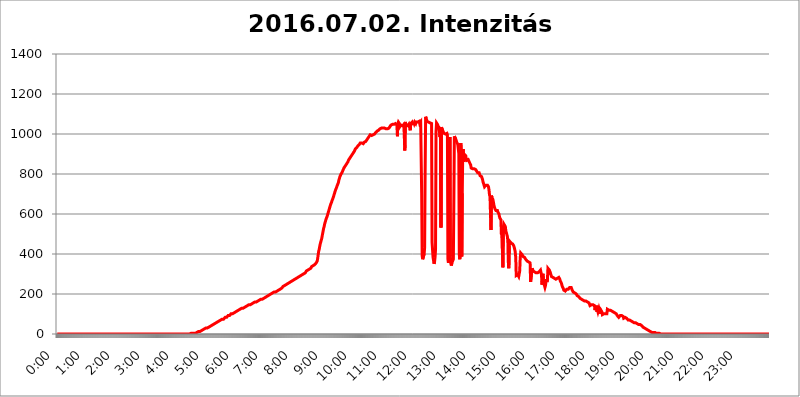
| Category | 2016.07.02. Intenzitás [W/m^2] |
|---|---|
| 0.0 | 0 |
| 0.0006944444444444445 | 0 |
| 0.001388888888888889 | 0 |
| 0.0020833333333333333 | 0 |
| 0.002777777777777778 | 0 |
| 0.003472222222222222 | 0 |
| 0.004166666666666667 | 0 |
| 0.004861111111111111 | 0 |
| 0.005555555555555556 | 0 |
| 0.0062499999999999995 | 0 |
| 0.006944444444444444 | 0 |
| 0.007638888888888889 | 0 |
| 0.008333333333333333 | 0 |
| 0.009027777777777779 | 0 |
| 0.009722222222222222 | 0 |
| 0.010416666666666666 | 0 |
| 0.011111111111111112 | 0 |
| 0.011805555555555555 | 0 |
| 0.012499999999999999 | 0 |
| 0.013194444444444444 | 0 |
| 0.013888888888888888 | 0 |
| 0.014583333333333332 | 0 |
| 0.015277777777777777 | 0 |
| 0.015972222222222224 | 0 |
| 0.016666666666666666 | 0 |
| 0.017361111111111112 | 0 |
| 0.018055555555555557 | 0 |
| 0.01875 | 0 |
| 0.019444444444444445 | 0 |
| 0.02013888888888889 | 0 |
| 0.020833333333333332 | 0 |
| 0.02152777777777778 | 0 |
| 0.022222222222222223 | 0 |
| 0.02291666666666667 | 0 |
| 0.02361111111111111 | 0 |
| 0.024305555555555556 | 0 |
| 0.024999999999999998 | 0 |
| 0.025694444444444447 | 0 |
| 0.02638888888888889 | 0 |
| 0.027083333333333334 | 0 |
| 0.027777777777777776 | 0 |
| 0.02847222222222222 | 0 |
| 0.029166666666666664 | 0 |
| 0.029861111111111113 | 0 |
| 0.030555555555555555 | 0 |
| 0.03125 | 0 |
| 0.03194444444444445 | 0 |
| 0.03263888888888889 | 0 |
| 0.03333333333333333 | 0 |
| 0.034027777777777775 | 0 |
| 0.034722222222222224 | 0 |
| 0.035416666666666666 | 0 |
| 0.036111111111111115 | 0 |
| 0.03680555555555556 | 0 |
| 0.0375 | 0 |
| 0.03819444444444444 | 0 |
| 0.03888888888888889 | 0 |
| 0.03958333333333333 | 0 |
| 0.04027777777777778 | 0 |
| 0.04097222222222222 | 0 |
| 0.041666666666666664 | 0 |
| 0.042361111111111106 | 0 |
| 0.04305555555555556 | 0 |
| 0.043750000000000004 | 0 |
| 0.044444444444444446 | 0 |
| 0.04513888888888889 | 0 |
| 0.04583333333333334 | 0 |
| 0.04652777777777778 | 0 |
| 0.04722222222222222 | 0 |
| 0.04791666666666666 | 0 |
| 0.04861111111111111 | 0 |
| 0.049305555555555554 | 0 |
| 0.049999999999999996 | 0 |
| 0.05069444444444445 | 0 |
| 0.051388888888888894 | 0 |
| 0.052083333333333336 | 0 |
| 0.05277777777777778 | 0 |
| 0.05347222222222222 | 0 |
| 0.05416666666666667 | 0 |
| 0.05486111111111111 | 0 |
| 0.05555555555555555 | 0 |
| 0.05625 | 0 |
| 0.05694444444444444 | 0 |
| 0.057638888888888885 | 0 |
| 0.05833333333333333 | 0 |
| 0.05902777777777778 | 0 |
| 0.059722222222222225 | 0 |
| 0.06041666666666667 | 0 |
| 0.061111111111111116 | 0 |
| 0.06180555555555556 | 0 |
| 0.0625 | 0 |
| 0.06319444444444444 | 0 |
| 0.06388888888888888 | 0 |
| 0.06458333333333334 | 0 |
| 0.06527777777777778 | 0 |
| 0.06597222222222222 | 0 |
| 0.06666666666666667 | 0 |
| 0.06736111111111111 | 0 |
| 0.06805555555555555 | 0 |
| 0.06874999999999999 | 0 |
| 0.06944444444444443 | 0 |
| 0.07013888888888889 | 0 |
| 0.07083333333333333 | 0 |
| 0.07152777777777779 | 0 |
| 0.07222222222222223 | 0 |
| 0.07291666666666667 | 0 |
| 0.07361111111111111 | 0 |
| 0.07430555555555556 | 0 |
| 0.075 | 0 |
| 0.07569444444444444 | 0 |
| 0.0763888888888889 | 0 |
| 0.07708333333333334 | 0 |
| 0.07777777777777778 | 0 |
| 0.07847222222222222 | 0 |
| 0.07916666666666666 | 0 |
| 0.0798611111111111 | 0 |
| 0.08055555555555556 | 0 |
| 0.08125 | 0 |
| 0.08194444444444444 | 0 |
| 0.08263888888888889 | 0 |
| 0.08333333333333333 | 0 |
| 0.08402777777777777 | 0 |
| 0.08472222222222221 | 0 |
| 0.08541666666666665 | 0 |
| 0.08611111111111112 | 0 |
| 0.08680555555555557 | 0 |
| 0.08750000000000001 | 0 |
| 0.08819444444444445 | 0 |
| 0.08888888888888889 | 0 |
| 0.08958333333333333 | 0 |
| 0.09027777777777778 | 0 |
| 0.09097222222222222 | 0 |
| 0.09166666666666667 | 0 |
| 0.09236111111111112 | 0 |
| 0.09305555555555556 | 0 |
| 0.09375 | 0 |
| 0.09444444444444444 | 0 |
| 0.09513888888888888 | 0 |
| 0.09583333333333333 | 0 |
| 0.09652777777777777 | 0 |
| 0.09722222222222222 | 0 |
| 0.09791666666666667 | 0 |
| 0.09861111111111111 | 0 |
| 0.09930555555555555 | 0 |
| 0.09999999999999999 | 0 |
| 0.10069444444444443 | 0 |
| 0.1013888888888889 | 0 |
| 0.10208333333333335 | 0 |
| 0.10277777777777779 | 0 |
| 0.10347222222222223 | 0 |
| 0.10416666666666667 | 0 |
| 0.10486111111111111 | 0 |
| 0.10555555555555556 | 0 |
| 0.10625 | 0 |
| 0.10694444444444444 | 0 |
| 0.1076388888888889 | 0 |
| 0.10833333333333334 | 0 |
| 0.10902777777777778 | 0 |
| 0.10972222222222222 | 0 |
| 0.1111111111111111 | 0 |
| 0.11180555555555556 | 0 |
| 0.11180555555555556 | 0 |
| 0.1125 | 0 |
| 0.11319444444444444 | 0 |
| 0.11388888888888889 | 0 |
| 0.11458333333333333 | 0 |
| 0.11527777777777777 | 0 |
| 0.11597222222222221 | 0 |
| 0.11666666666666665 | 0 |
| 0.1173611111111111 | 0 |
| 0.11805555555555557 | 0 |
| 0.11944444444444445 | 0 |
| 0.12013888888888889 | 0 |
| 0.12083333333333333 | 0 |
| 0.12152777777777778 | 0 |
| 0.12222222222222223 | 0 |
| 0.12291666666666667 | 0 |
| 0.12291666666666667 | 0 |
| 0.12361111111111112 | 0 |
| 0.12430555555555556 | 0 |
| 0.125 | 0 |
| 0.12569444444444444 | 0 |
| 0.12638888888888888 | 0 |
| 0.12708333333333333 | 0 |
| 0.16875 | 0 |
| 0.12847222222222224 | 0 |
| 0.12916666666666668 | 0 |
| 0.12986111111111112 | 0 |
| 0.13055555555555556 | 0 |
| 0.13125 | 0 |
| 0.13194444444444445 | 0 |
| 0.1326388888888889 | 0 |
| 0.13333333333333333 | 0 |
| 0.13402777777777777 | 0 |
| 0.13402777777777777 | 0 |
| 0.13472222222222222 | 0 |
| 0.13541666666666666 | 0 |
| 0.1361111111111111 | 0 |
| 0.13749999999999998 | 0 |
| 0.13819444444444443 | 0 |
| 0.1388888888888889 | 0 |
| 0.13958333333333334 | 0 |
| 0.14027777777777778 | 0 |
| 0.14097222222222222 | 0 |
| 0.14166666666666666 | 0 |
| 0.1423611111111111 | 0 |
| 0.14305555555555557 | 0 |
| 0.14375000000000002 | 0 |
| 0.14444444444444446 | 0 |
| 0.1451388888888889 | 0 |
| 0.1451388888888889 | 0 |
| 0.14652777777777778 | 0 |
| 0.14722222222222223 | 0 |
| 0.14791666666666667 | 0 |
| 0.1486111111111111 | 0 |
| 0.14930555555555555 | 0 |
| 0.15 | 0 |
| 0.15069444444444444 | 0 |
| 0.15138888888888888 | 0 |
| 0.15208333333333332 | 0 |
| 0.15277777777777776 | 0 |
| 0.15347222222222223 | 0 |
| 0.15416666666666667 | 0 |
| 0.15486111111111112 | 0 |
| 0.15555555555555556 | 0 |
| 0.15625 | 0 |
| 0.15694444444444444 | 0 |
| 0.15763888888888888 | 0 |
| 0.15833333333333333 | 0 |
| 0.15902777777777777 | 0 |
| 0.15972222222222224 | 0 |
| 0.16041666666666668 | 0 |
| 0.16111111111111112 | 0 |
| 0.16180555555555556 | 0 |
| 0.1625 | 0 |
| 0.16319444444444445 | 0 |
| 0.1638888888888889 | 0 |
| 0.16458333333333333 | 0 |
| 0.16527777777777777 | 0 |
| 0.16597222222222222 | 0 |
| 0.16666666666666666 | 0 |
| 0.1673611111111111 | 0 |
| 0.16805555555555554 | 0 |
| 0.16874999999999998 | 0 |
| 0.16944444444444443 | 0 |
| 0.17013888888888887 | 0 |
| 0.1708333333333333 | 0 |
| 0.17152777777777775 | 0 |
| 0.17222222222222225 | 0 |
| 0.1729166666666667 | 0 |
| 0.17361111111111113 | 0 |
| 0.17430555555555557 | 0 |
| 0.17500000000000002 | 0 |
| 0.17569444444444446 | 0 |
| 0.1763888888888889 | 0 |
| 0.17708333333333334 | 0 |
| 0.17777777777777778 | 0 |
| 0.17847222222222223 | 0 |
| 0.17916666666666667 | 0 |
| 0.1798611111111111 | 0 |
| 0.18055555555555555 | 0 |
| 0.18125 | 0 |
| 0.18194444444444444 | 0 |
| 0.1826388888888889 | 0 |
| 0.18333333333333335 | 0 |
| 0.1840277777777778 | 0 |
| 0.18472222222222223 | 0 |
| 0.18541666666666667 | 0 |
| 0.18611111111111112 | 0 |
| 0.18680555555555556 | 0 |
| 0.1875 | 3.525 |
| 0.18819444444444444 | 0 |
| 0.18888888888888888 | 3.525 |
| 0.18958333333333333 | 3.525 |
| 0.19027777777777777 | 3.525 |
| 0.1909722222222222 | 3.525 |
| 0.19166666666666665 | 3.525 |
| 0.19236111111111112 | 3.525 |
| 0.19305555555555554 | 3.525 |
| 0.19375 | 3.525 |
| 0.19444444444444445 | 7.887 |
| 0.1951388888888889 | 7.887 |
| 0.19583333333333333 | 7.887 |
| 0.19652777777777777 | 7.887 |
| 0.19722222222222222 | 7.887 |
| 0.19791666666666666 | 12.257 |
| 0.1986111111111111 | 12.257 |
| 0.19930555555555554 | 12.257 |
| 0.19999999999999998 | 12.257 |
| 0.20069444444444443 | 12.257 |
| 0.20138888888888887 | 16.636 |
| 0.2020833333333333 | 16.636 |
| 0.2027777777777778 | 16.636 |
| 0.2034722222222222 | 21.024 |
| 0.2041666666666667 | 21.024 |
| 0.20486111111111113 | 21.024 |
| 0.20555555555555557 | 21.024 |
| 0.20625000000000002 | 25.419 |
| 0.20694444444444446 | 25.419 |
| 0.2076388888888889 | 25.419 |
| 0.20833333333333334 | 29.823 |
| 0.20902777777777778 | 29.823 |
| 0.20972222222222223 | 29.823 |
| 0.21041666666666667 | 29.823 |
| 0.2111111111111111 | 34.234 |
| 0.21180555555555555 | 34.234 |
| 0.2125 | 34.234 |
| 0.21319444444444444 | 38.653 |
| 0.2138888888888889 | 38.653 |
| 0.21458333333333335 | 38.653 |
| 0.2152777777777778 | 38.653 |
| 0.21597222222222223 | 43.079 |
| 0.21666666666666667 | 43.079 |
| 0.21736111111111112 | 43.079 |
| 0.21805555555555556 | 47.511 |
| 0.21875 | 47.511 |
| 0.21944444444444444 | 47.511 |
| 0.22013888888888888 | 51.951 |
| 0.22083333333333333 | 51.951 |
| 0.22152777777777777 | 51.951 |
| 0.2222222222222222 | 56.398 |
| 0.22291666666666665 | 56.398 |
| 0.2236111111111111 | 56.398 |
| 0.22430555555555556 | 56.398 |
| 0.225 | 60.85 |
| 0.22569444444444445 | 60.85 |
| 0.2263888888888889 | 60.85 |
| 0.22708333333333333 | 65.31 |
| 0.22777777777777777 | 65.31 |
| 0.22847222222222222 | 65.31 |
| 0.22916666666666666 | 69.775 |
| 0.2298611111111111 | 69.775 |
| 0.23055555555555554 | 69.775 |
| 0.23124999999999998 | 74.246 |
| 0.23194444444444443 | 74.246 |
| 0.23263888888888887 | 74.246 |
| 0.2333333333333333 | 74.246 |
| 0.2340277777777778 | 78.722 |
| 0.2347222222222222 | 78.722 |
| 0.2354166666666667 | 83.205 |
| 0.23611111111111113 | 83.205 |
| 0.23680555555555557 | 83.205 |
| 0.23750000000000002 | 83.205 |
| 0.23819444444444446 | 87.692 |
| 0.2388888888888889 | 87.692 |
| 0.23958333333333334 | 92.184 |
| 0.24027777777777778 | 92.184 |
| 0.24097222222222223 | 92.184 |
| 0.24166666666666667 | 92.184 |
| 0.2423611111111111 | 96.682 |
| 0.24305555555555555 | 96.682 |
| 0.24375 | 101.184 |
| 0.24444444444444446 | 101.184 |
| 0.24513888888888888 | 101.184 |
| 0.24583333333333335 | 101.184 |
| 0.2465277777777778 | 105.69 |
| 0.24722222222222223 | 105.69 |
| 0.24791666666666667 | 105.69 |
| 0.24861111111111112 | 110.201 |
| 0.24930555555555556 | 110.201 |
| 0.25 | 110.201 |
| 0.25069444444444444 | 110.201 |
| 0.2513888888888889 | 114.716 |
| 0.2520833333333333 | 114.716 |
| 0.25277777777777777 | 119.235 |
| 0.2534722222222222 | 119.235 |
| 0.25416666666666665 | 119.235 |
| 0.2548611111111111 | 119.235 |
| 0.2555555555555556 | 123.758 |
| 0.25625000000000003 | 123.758 |
| 0.2569444444444445 | 123.758 |
| 0.2576388888888889 | 123.758 |
| 0.25833333333333336 | 128.284 |
| 0.2590277777777778 | 128.284 |
| 0.25972222222222224 | 128.284 |
| 0.2604166666666667 | 128.284 |
| 0.2611111111111111 | 132.814 |
| 0.26180555555555557 | 132.814 |
| 0.2625 | 132.814 |
| 0.26319444444444445 | 137.347 |
| 0.2638888888888889 | 137.347 |
| 0.26458333333333334 | 137.347 |
| 0.2652777777777778 | 137.347 |
| 0.2659722222222222 | 141.884 |
| 0.26666666666666666 | 141.884 |
| 0.2673611111111111 | 141.884 |
| 0.26805555555555555 | 146.423 |
| 0.26875 | 146.423 |
| 0.26944444444444443 | 146.423 |
| 0.2701388888888889 | 146.423 |
| 0.2708333333333333 | 146.423 |
| 0.27152777777777776 | 150.964 |
| 0.2722222222222222 | 150.964 |
| 0.27291666666666664 | 150.964 |
| 0.2736111111111111 | 155.509 |
| 0.2743055555555555 | 155.509 |
| 0.27499999999999997 | 155.509 |
| 0.27569444444444446 | 155.509 |
| 0.27638888888888885 | 155.509 |
| 0.27708333333333335 | 160.056 |
| 0.2777777777777778 | 160.056 |
| 0.27847222222222223 | 160.056 |
| 0.2791666666666667 | 160.056 |
| 0.2798611111111111 | 164.605 |
| 0.28055555555555556 | 164.605 |
| 0.28125 | 164.605 |
| 0.28194444444444444 | 164.605 |
| 0.2826388888888889 | 169.156 |
| 0.2833333333333333 | 169.156 |
| 0.28402777777777777 | 169.156 |
| 0.2847222222222222 | 169.156 |
| 0.28541666666666665 | 173.709 |
| 0.28611111111111115 | 173.709 |
| 0.28680555555555554 | 173.709 |
| 0.28750000000000003 | 173.709 |
| 0.2881944444444445 | 173.709 |
| 0.2888888888888889 | 178.264 |
| 0.28958333333333336 | 178.264 |
| 0.2902777777777778 | 178.264 |
| 0.29097222222222224 | 182.82 |
| 0.2916666666666667 | 182.82 |
| 0.2923611111111111 | 182.82 |
| 0.29305555555555557 | 187.378 |
| 0.29375 | 187.378 |
| 0.29444444444444445 | 187.378 |
| 0.2951388888888889 | 191.937 |
| 0.29583333333333334 | 191.937 |
| 0.2965277777777778 | 191.937 |
| 0.2972222222222222 | 191.937 |
| 0.29791666666666666 | 196.497 |
| 0.2986111111111111 | 196.497 |
| 0.29930555555555555 | 196.497 |
| 0.3 | 201.058 |
| 0.30069444444444443 | 201.058 |
| 0.3013888888888889 | 201.058 |
| 0.3020833333333333 | 205.62 |
| 0.30277777777777776 | 205.62 |
| 0.3034722222222222 | 205.62 |
| 0.30416666666666664 | 210.182 |
| 0.3048611111111111 | 210.182 |
| 0.3055555555555555 | 210.182 |
| 0.30624999999999997 | 210.182 |
| 0.3069444444444444 | 210.182 |
| 0.3076388888888889 | 214.746 |
| 0.30833333333333335 | 214.746 |
| 0.3090277777777778 | 219.309 |
| 0.30972222222222223 | 219.309 |
| 0.3104166666666667 | 219.309 |
| 0.3111111111111111 | 223.873 |
| 0.31180555555555556 | 223.873 |
| 0.3125 | 223.873 |
| 0.31319444444444444 | 228.436 |
| 0.3138888888888889 | 228.436 |
| 0.3145833333333333 | 228.436 |
| 0.31527777777777777 | 233 |
| 0.3159722222222222 | 233 |
| 0.31666666666666665 | 237.564 |
| 0.31736111111111115 | 237.564 |
| 0.31805555555555554 | 237.564 |
| 0.31875000000000003 | 242.127 |
| 0.3194444444444445 | 242.127 |
| 0.3201388888888889 | 242.127 |
| 0.32083333333333336 | 246.689 |
| 0.3215277777777778 | 246.689 |
| 0.32222222222222224 | 251.251 |
| 0.3229166666666667 | 251.251 |
| 0.3236111111111111 | 251.251 |
| 0.32430555555555557 | 251.251 |
| 0.325 | 255.813 |
| 0.32569444444444445 | 255.813 |
| 0.3263888888888889 | 260.373 |
| 0.32708333333333334 | 260.373 |
| 0.3277777777777778 | 260.373 |
| 0.3284722222222222 | 264.932 |
| 0.32916666666666666 | 264.932 |
| 0.3298611111111111 | 264.932 |
| 0.33055555555555555 | 269.49 |
| 0.33125 | 269.49 |
| 0.33194444444444443 | 269.49 |
| 0.3326388888888889 | 274.047 |
| 0.3333333333333333 | 274.047 |
| 0.3340277777777778 | 274.047 |
| 0.3347222222222222 | 278.603 |
| 0.3354166666666667 | 278.603 |
| 0.3361111111111111 | 278.603 |
| 0.3368055555555556 | 278.603 |
| 0.33749999999999997 | 283.156 |
| 0.33819444444444446 | 283.156 |
| 0.33888888888888885 | 287.709 |
| 0.33958333333333335 | 287.709 |
| 0.34027777777777773 | 287.709 |
| 0.34097222222222223 | 292.259 |
| 0.3416666666666666 | 292.259 |
| 0.3423611111111111 | 292.259 |
| 0.3430555555555555 | 296.808 |
| 0.34375 | 296.808 |
| 0.3444444444444445 | 301.354 |
| 0.3451388888888889 | 301.354 |
| 0.3458333333333334 | 301.354 |
| 0.34652777777777777 | 305.898 |
| 0.34722222222222227 | 305.898 |
| 0.34791666666666665 | 305.898 |
| 0.34861111111111115 | 310.44 |
| 0.34930555555555554 | 314.98 |
| 0.35000000000000003 | 314.98 |
| 0.3506944444444444 | 314.98 |
| 0.3513888888888889 | 319.517 |
| 0.3520833333333333 | 319.517 |
| 0.3527777777777778 | 324.052 |
| 0.3534722222222222 | 324.052 |
| 0.3541666666666667 | 328.584 |
| 0.3548611111111111 | 328.584 |
| 0.35555555555555557 | 328.584 |
| 0.35625 | 333.113 |
| 0.35694444444444445 | 337.639 |
| 0.3576388888888889 | 337.639 |
| 0.35833333333333334 | 342.162 |
| 0.3590277777777778 | 342.162 |
| 0.3597222222222222 | 342.162 |
| 0.36041666666666666 | 346.682 |
| 0.3611111111111111 | 346.682 |
| 0.36180555555555555 | 351.198 |
| 0.3625 | 351.198 |
| 0.36319444444444443 | 355.712 |
| 0.3638888888888889 | 360.221 |
| 0.3645833333333333 | 364.728 |
| 0.3652777777777778 | 378.224 |
| 0.3659722222222222 | 396.164 |
| 0.3666666666666667 | 414.035 |
| 0.3673611111111111 | 422.943 |
| 0.3680555555555556 | 436.27 |
| 0.36874999999999997 | 449.551 |
| 0.36944444444444446 | 458.38 |
| 0.37013888888888885 | 467.187 |
| 0.37083333333333335 | 475.972 |
| 0.37152777777777773 | 489.108 |
| 0.37222222222222223 | 502.192 |
| 0.3729166666666666 | 515.223 |
| 0.3736111111111111 | 528.2 |
| 0.3743055555555555 | 536.82 |
| 0.375 | 549.704 |
| 0.3756944444444445 | 558.261 |
| 0.3763888888888889 | 566.793 |
| 0.3770833333333334 | 575.299 |
| 0.37777777777777777 | 579.542 |
| 0.37847222222222227 | 588.009 |
| 0.37916666666666665 | 596.45 |
| 0.37986111111111115 | 604.864 |
| 0.38055555555555554 | 613.252 |
| 0.38125000000000003 | 621.613 |
| 0.3819444444444444 | 629.948 |
| 0.3826388888888889 | 638.256 |
| 0.3833333333333333 | 646.537 |
| 0.3840277777777778 | 650.667 |
| 0.3847222222222222 | 658.909 |
| 0.3854166666666667 | 667.123 |
| 0.3861111111111111 | 671.22 |
| 0.38680555555555557 | 679.395 |
| 0.3875 | 687.544 |
| 0.38819444444444445 | 695.666 |
| 0.3888888888888889 | 703.762 |
| 0.38958333333333334 | 711.832 |
| 0.3902777777777778 | 719.877 |
| 0.3909722222222222 | 723.889 |
| 0.39166666666666666 | 731.896 |
| 0.3923611111111111 | 739.877 |
| 0.39305555555555555 | 743.859 |
| 0.39375 | 751.803 |
| 0.39444444444444443 | 759.723 |
| 0.3951388888888889 | 771.559 |
| 0.3958333333333333 | 779.42 |
| 0.3965277777777778 | 787.258 |
| 0.3972222222222222 | 791.169 |
| 0.3979166666666667 | 798.974 |
| 0.3986111111111111 | 802.868 |
| 0.3993055555555556 | 806.757 |
| 0.39999999999999997 | 810.641 |
| 0.40069444444444446 | 818.392 |
| 0.40138888888888885 | 822.26 |
| 0.40208333333333335 | 829.981 |
| 0.40277777777777773 | 833.834 |
| 0.40347222222222223 | 837.682 |
| 0.4041666666666666 | 841.526 |
| 0.4048611111111111 | 845.365 |
| 0.4055555555555555 | 849.199 |
| 0.40625 | 853.029 |
| 0.4069444444444445 | 856.855 |
| 0.4076388888888889 | 860.676 |
| 0.4083333333333334 | 868.305 |
| 0.40902777777777777 | 872.114 |
| 0.40972222222222227 | 875.918 |
| 0.41041666666666665 | 879.719 |
| 0.41111111111111115 | 883.516 |
| 0.41180555555555554 | 887.309 |
| 0.41250000000000003 | 891.099 |
| 0.4131944444444444 | 894.885 |
| 0.4138888888888889 | 898.668 |
| 0.4145833333333333 | 902.447 |
| 0.4152777777777778 | 906.223 |
| 0.4159722222222222 | 909.996 |
| 0.4166666666666667 | 913.766 |
| 0.4173611111111111 | 917.534 |
| 0.41805555555555557 | 925.06 |
| 0.41875 | 925.06 |
| 0.41944444444444445 | 928.819 |
| 0.4201388888888889 | 932.576 |
| 0.42083333333333334 | 936.33 |
| 0.4215277777777778 | 940.082 |
| 0.4222222222222222 | 943.832 |
| 0.42291666666666666 | 943.832 |
| 0.4236111111111111 | 947.58 |
| 0.42430555555555555 | 951.327 |
| 0.425 | 955.071 |
| 0.42569444444444443 | 955.071 |
| 0.4263888888888889 | 955.071 |
| 0.4270833333333333 | 955.071 |
| 0.4277777777777778 | 951.327 |
| 0.4284722222222222 | 951.327 |
| 0.4291666666666667 | 951.327 |
| 0.4298611111111111 | 951.327 |
| 0.4305555555555556 | 958.814 |
| 0.43124999999999997 | 958.814 |
| 0.43194444444444446 | 958.814 |
| 0.43263888888888885 | 962.555 |
| 0.43333333333333335 | 966.295 |
| 0.43402777777777773 | 970.034 |
| 0.43472222222222223 | 973.772 |
| 0.4354166666666666 | 977.508 |
| 0.4361111111111111 | 977.508 |
| 0.4368055555555555 | 981.244 |
| 0.4375 | 988.714 |
| 0.4381944444444445 | 992.448 |
| 0.4388888888888889 | 996.182 |
| 0.4395833333333334 | 996.182 |
| 0.44027777777777777 | 996.182 |
| 0.44097222222222227 | 992.448 |
| 0.44166666666666665 | 992.448 |
| 0.44236111111111115 | 996.182 |
| 0.44305555555555554 | 996.182 |
| 0.44375000000000003 | 999.916 |
| 0.4444444444444444 | 999.916 |
| 0.4451388888888889 | 999.916 |
| 0.4458333333333333 | 1003.65 |
| 0.4465277777777778 | 1007.383 |
| 0.4472222222222222 | 1007.383 |
| 0.4479166666666667 | 1011.118 |
| 0.4486111111111111 | 1014.852 |
| 0.44930555555555557 | 1014.852 |
| 0.45 | 1018.587 |
| 0.45069444444444445 | 1018.587 |
| 0.4513888888888889 | 1022.323 |
| 0.45208333333333334 | 1022.323 |
| 0.4527777777777778 | 1026.06 |
| 0.4534722222222222 | 1026.06 |
| 0.45416666666666666 | 1029.798 |
| 0.4548611111111111 | 1029.798 |
| 0.45555555555555555 | 1029.798 |
| 0.45625 | 1029.798 |
| 0.45694444444444443 | 1029.798 |
| 0.4576388888888889 | 1033.537 |
| 0.4583333333333333 | 1029.798 |
| 0.4590277777777778 | 1029.798 |
| 0.4597222222222222 | 1026.06 |
| 0.4604166666666667 | 1026.06 |
| 0.4611111111111111 | 1026.06 |
| 0.4618055555555556 | 1026.06 |
| 0.46249999999999997 | 1026.06 |
| 0.46319444444444446 | 1026.06 |
| 0.46388888888888885 | 1026.06 |
| 0.46458333333333335 | 1026.06 |
| 0.46527777777777773 | 1029.798 |
| 0.46597222222222223 | 1033.537 |
| 0.4666666666666666 | 1037.277 |
| 0.4673611111111111 | 1041.019 |
| 0.4680555555555555 | 1044.762 |
| 0.46875 | 1048.508 |
| 0.4694444444444445 | 1048.508 |
| 0.4701388888888889 | 1048.508 |
| 0.4708333333333334 | 1048.508 |
| 0.47152777777777777 | 1044.762 |
| 0.47222222222222227 | 1048.508 |
| 0.47291666666666665 | 1052.255 |
| 0.47361111111111115 | 1052.255 |
| 0.47430555555555554 | 1052.255 |
| 0.47500000000000003 | 1052.255 |
| 0.4756944444444444 | 1052.255 |
| 0.4763888888888889 | 1044.762 |
| 0.4770833333333333 | 988.714 |
| 0.4777777777777778 | 1052.255 |
| 0.4784722222222222 | 1059.756 |
| 0.4791666666666667 | 1063.51 |
| 0.4798611111111111 | 1052.255 |
| 0.48055555555555557 | 1037.277 |
| 0.48125 | 1037.277 |
| 0.48194444444444445 | 1044.762 |
| 0.4826388888888889 | 1041.019 |
| 0.48333333333333334 | 1044.762 |
| 0.4840277777777778 | 1041.019 |
| 0.4847222222222222 | 1041.019 |
| 0.48541666666666666 | 1041.019 |
| 0.4861111111111111 | 1048.508 |
| 0.48680555555555555 | 1052.255 |
| 0.4875 | 917.534 |
| 0.48819444444444443 | 1059.756 |
| 0.4888888888888889 | 1048.508 |
| 0.4895833333333333 | 1041.019 |
| 0.4902777777777778 | 1044.762 |
| 0.4909722222222222 | 1037.277 |
| 0.4916666666666667 | 1041.019 |
| 0.4923611111111111 | 1041.019 |
| 0.4930555555555556 | 1048.508 |
| 0.49374999999999997 | 1052.255 |
| 0.49444444444444446 | 1052.255 |
| 0.49513888888888885 | 1018.587 |
| 0.49583333333333335 | 1052.255 |
| 0.49652777777777773 | 1052.255 |
| 0.49722222222222223 | 1052.255 |
| 0.4979166666666666 | 1059.756 |
| 0.4986111111111111 | 1059.756 |
| 0.4993055555555555 | 1044.762 |
| 0.5 | 1059.756 |
| 0.5006944444444444 | 1052.255 |
| 0.5013888888888889 | 1059.756 |
| 0.5020833333333333 | 1056.004 |
| 0.5027777777777778 | 1052.255 |
| 0.5034722222222222 | 1059.756 |
| 0.5041666666666667 | 1059.756 |
| 0.5048611111111111 | 1063.51 |
| 0.5055555555555555 | 1059.756 |
| 0.50625 | 1063.51 |
| 0.5069444444444444 | 1059.756 |
| 0.5076388888888889 | 1063.51 |
| 0.5083333333333333 | 1052.255 |
| 0.5090277777777777 | 1052.255 |
| 0.5097222222222222 | 1059.756 |
| 0.5104166666666666 | 1059.756 |
| 0.5111111111111112 | 703.762 |
| 0.5118055555555555 | 391.685 |
| 0.5125000000000001 | 373.729 |
| 0.5131944444444444 | 373.729 |
| 0.513888888888889 | 378.224 |
| 0.5145833333333333 | 400.638 |
| 0.5152777777777778 | 431.833 |
| 0.5159722222222222 | 810.641 |
| 0.5166666666666667 | 1086.097 |
| 0.517361111111111 | 1078.555 |
| 0.5180555555555556 | 1071.027 |
| 0.5187499999999999 | 1063.51 |
| 0.5194444444444445 | 1063.51 |
| 0.5201388888888888 | 1063.51 |
| 0.5208333333333334 | 1059.756 |
| 0.5215277777777778 | 1059.756 |
| 0.5222222222222223 | 1059.756 |
| 0.5229166666666667 | 1056.004 |
| 0.5236111111111111 | 1059.756 |
| 0.5243055555555556 | 1052.255 |
| 0.525 | 1052.255 |
| 0.5256944444444445 | 458.38 |
| 0.5263888888888889 | 462.786 |
| 0.5270833333333333 | 382.715 |
| 0.5277777777777778 | 382.715 |
| 0.5284722222222222 | 351.198 |
| 0.5291666666666667 | 360.221 |
| 0.5298611111111111 | 382.715 |
| 0.5305555555555556 | 422.943 |
| 0.53125 | 1011.118 |
| 0.5319444444444444 | 1056.004 |
| 0.5326388888888889 | 1059.756 |
| 0.5333333333333333 | 1048.508 |
| 0.5340277777777778 | 1041.019 |
| 0.5347222222222222 | 1037.277 |
| 0.5354166666666667 | 1033.537 |
| 0.5361111111111111 | 1037.277 |
| 0.5368055555555555 | 984.98 |
| 0.5375 | 1033.537 |
| 0.5381944444444444 | 532.513 |
| 0.5388888888888889 | 1033.537 |
| 0.5395833333333333 | 1029.798 |
| 0.5402777777777777 | 1029.798 |
| 0.5409722222222222 | 1014.852 |
| 0.5416666666666666 | 1014.852 |
| 0.5423611111111112 | 1003.65 |
| 0.5430555555555555 | 1003.65 |
| 0.5437500000000001 | 1007.383 |
| 0.5444444444444444 | 999.916 |
| 0.545138888888889 | 996.182 |
| 0.5458333333333333 | 999.916 |
| 0.5465277777777778 | 1003.65 |
| 0.5472222222222222 | 996.182 |
| 0.5479166666666667 | 373.729 |
| 0.548611111111111 | 355.712 |
| 0.5493055555555556 | 369.23 |
| 0.5499999999999999 | 409.574 |
| 0.5506944444444445 | 984.98 |
| 0.5513888888888888 | 387.202 |
| 0.5520833333333334 | 351.198 |
| 0.5527777777777778 | 342.162 |
| 0.5534722222222223 | 355.712 |
| 0.5541666666666667 | 351.198 |
| 0.5548611111111111 | 355.712 |
| 0.5555555555555556 | 373.729 |
| 0.55625 | 658.909 |
| 0.5569444444444445 | 988.714 |
| 0.5576388888888889 | 988.714 |
| 0.5583333333333333 | 984.98 |
| 0.5590277777777778 | 973.772 |
| 0.5597222222222222 | 966.295 |
| 0.5604166666666667 | 958.814 |
| 0.5611111111111111 | 955.071 |
| 0.5618055555555556 | 947.58 |
| 0.5625 | 951.327 |
| 0.5631944444444444 | 902.447 |
| 0.5638888888888889 | 396.164 |
| 0.5645833333333333 | 373.729 |
| 0.5652777777777778 | 414.035 |
| 0.5659722222222222 | 955.071 |
| 0.5666666666666667 | 898.668 |
| 0.5673611111111111 | 387.202 |
| 0.5680555555555555 | 703.762 |
| 0.56875 | 913.766 |
| 0.5694444444444444 | 925.06 |
| 0.5701388888888889 | 860.676 |
| 0.5708333333333333 | 898.668 |
| 0.5715277777777777 | 902.447 |
| 0.5722222222222222 | 894.885 |
| 0.5729166666666666 | 891.099 |
| 0.5736111111111112 | 875.918 |
| 0.5743055555555555 | 868.305 |
| 0.5750000000000001 | 864.493 |
| 0.5756944444444444 | 868.305 |
| 0.576388888888889 | 872.114 |
| 0.5770833333333333 | 868.305 |
| 0.5777777777777778 | 860.676 |
| 0.5784722222222222 | 856.855 |
| 0.5791666666666667 | 860.676 |
| 0.579861111111111 | 845.365 |
| 0.5805555555555556 | 829.981 |
| 0.5812499999999999 | 826.123 |
| 0.5819444444444445 | 829.981 |
| 0.5826388888888888 | 826.123 |
| 0.5833333333333334 | 829.981 |
| 0.5840277777777778 | 829.981 |
| 0.5847222222222223 | 826.123 |
| 0.5854166666666667 | 829.981 |
| 0.5861111111111111 | 826.123 |
| 0.5868055555555556 | 822.26 |
| 0.5875 | 818.392 |
| 0.5881944444444445 | 814.519 |
| 0.5888888888888889 | 814.519 |
| 0.5895833333333333 | 806.757 |
| 0.5902777777777778 | 810.641 |
| 0.5909722222222222 | 806.757 |
| 0.5916666666666667 | 806.757 |
| 0.5923611111111111 | 798.974 |
| 0.5930555555555556 | 791.169 |
| 0.59375 | 787.258 |
| 0.5944444444444444 | 791.169 |
| 0.5951388888888889 | 787.258 |
| 0.5958333333333333 | 783.342 |
| 0.5965277777777778 | 771.559 |
| 0.5972222222222222 | 759.723 |
| 0.5979166666666667 | 751.803 |
| 0.5986111111111111 | 743.859 |
| 0.5993055555555555 | 735.89 |
| 0.6 | 739.877 |
| 0.6006944444444444 | 739.877 |
| 0.6013888888888889 | 743.859 |
| 0.6020833333333333 | 739.877 |
| 0.6027777777777777 | 743.859 |
| 0.6034722222222222 | 743.859 |
| 0.6041666666666666 | 739.877 |
| 0.6048611111111112 | 735.89 |
| 0.6055555555555555 | 719.877 |
| 0.6062500000000001 | 695.666 |
| 0.6069444444444444 | 687.544 |
| 0.607638888888889 | 687.544 |
| 0.6083333333333333 | 519.555 |
| 0.6090277777777778 | 691.608 |
| 0.6097222222222222 | 683.473 |
| 0.6104166666666667 | 679.395 |
| 0.611111111111111 | 671.22 |
| 0.6118055555555556 | 658.909 |
| 0.6124999999999999 | 642.4 |
| 0.6131944444444445 | 634.105 |
| 0.6138888888888888 | 625.784 |
| 0.6145833333333334 | 621.613 |
| 0.6152777777777778 | 617.436 |
| 0.6159722222222223 | 613.252 |
| 0.6166666666666667 | 617.436 |
| 0.6173611111111111 | 617.436 |
| 0.6180555555555556 | 609.062 |
| 0.61875 | 604.864 |
| 0.6194444444444445 | 600.661 |
| 0.6201388888888889 | 588.009 |
| 0.6208333333333333 | 579.542 |
| 0.6215277777777778 | 575.299 |
| 0.6222222222222222 | 571.049 |
| 0.6229166666666667 | 497.836 |
| 0.6236111111111111 | 532.513 |
| 0.6243055555555556 | 427.39 |
| 0.625 | 333.113 |
| 0.6256944444444444 | 536.82 |
| 0.6263888888888889 | 549.704 |
| 0.6270833333333333 | 549.704 |
| 0.6277777777777778 | 545.416 |
| 0.6284722222222222 | 536.82 |
| 0.6291666666666667 | 515.223 |
| 0.6298611111111111 | 506.542 |
| 0.6305555555555555 | 502.192 |
| 0.63125 | 489.108 |
| 0.6319444444444444 | 467.187 |
| 0.6326388888888889 | 360.221 |
| 0.6333333333333333 | 328.584 |
| 0.6340277777777777 | 440.702 |
| 0.6347222222222222 | 462.786 |
| 0.6354166666666666 | 458.38 |
| 0.6361111111111112 | 458.38 |
| 0.6368055555555555 | 453.968 |
| 0.6375000000000001 | 453.968 |
| 0.6381944444444444 | 449.551 |
| 0.638888888888889 | 449.551 |
| 0.6395833333333333 | 445.129 |
| 0.6402777777777778 | 440.702 |
| 0.6409722222222222 | 431.833 |
| 0.6416666666666667 | 422.943 |
| 0.642361111111111 | 409.574 |
| 0.6430555555555556 | 382.715 |
| 0.6437499999999999 | 292.259 |
| 0.6444444444444445 | 287.709 |
| 0.6451388888888888 | 292.259 |
| 0.6458333333333334 | 296.808 |
| 0.6465277777777778 | 296.808 |
| 0.6472222222222223 | 287.709 |
| 0.6479166666666667 | 292.259 |
| 0.6486111111111111 | 314.98 |
| 0.6493055555555556 | 378.224 |
| 0.65 | 405.108 |
| 0.6506944444444445 | 405.108 |
| 0.6513888888888889 | 400.638 |
| 0.6520833333333333 | 396.164 |
| 0.6527777777777778 | 396.164 |
| 0.6534722222222222 | 387.202 |
| 0.6541666666666667 | 387.202 |
| 0.6548611111111111 | 382.715 |
| 0.6555555555555556 | 382.715 |
| 0.65625 | 378.224 |
| 0.6569444444444444 | 373.729 |
| 0.6576388888888889 | 369.23 |
| 0.6583333333333333 | 369.23 |
| 0.6590277777777778 | 364.728 |
| 0.6597222222222222 | 364.728 |
| 0.6604166666666667 | 360.221 |
| 0.6611111111111111 | 360.221 |
| 0.6618055555555555 | 360.221 |
| 0.6625 | 360.221 |
| 0.6631944444444444 | 355.712 |
| 0.6638888888888889 | 260.373 |
| 0.6645833333333333 | 260.373 |
| 0.6652777777777777 | 264.932 |
| 0.6659722222222222 | 328.584 |
| 0.6666666666666666 | 324.052 |
| 0.6673611111111111 | 314.98 |
| 0.6680555555555556 | 314.98 |
| 0.6687500000000001 | 314.98 |
| 0.6694444444444444 | 310.44 |
| 0.6701388888888888 | 305.898 |
| 0.6708333333333334 | 305.898 |
| 0.6715277777777778 | 305.898 |
| 0.6722222222222222 | 305.898 |
| 0.6729166666666666 | 310.44 |
| 0.6736111111111112 | 305.898 |
| 0.6743055555555556 | 310.44 |
| 0.6749999999999999 | 310.44 |
| 0.6756944444444444 | 310.44 |
| 0.6763888888888889 | 314.98 |
| 0.6770833333333334 | 314.98 |
| 0.6777777777777777 | 319.517 |
| 0.6784722222222223 | 314.98 |
| 0.6791666666666667 | 296.808 |
| 0.6798611111111111 | 246.689 |
| 0.6805555555555555 | 269.49 |
| 0.68125 | 301.354 |
| 0.6819444444444445 | 260.373 |
| 0.6826388888888889 | 251.251 |
| 0.6833333333333332 | 242.127 |
| 0.6840277777777778 | 233 |
| 0.6847222222222222 | 242.127 |
| 0.6854166666666667 | 242.127 |
| 0.686111111111111 | 274.047 |
| 0.6868055555555556 | 260.373 |
| 0.6875 | 274.047 |
| 0.6881944444444444 | 328.584 |
| 0.688888888888889 | 328.584 |
| 0.6895833333333333 | 324.052 |
| 0.6902777777777778 | 319.517 |
| 0.6909722222222222 | 314.98 |
| 0.6916666666666668 | 305.898 |
| 0.6923611111111111 | 296.808 |
| 0.6930555555555555 | 287.709 |
| 0.69375 | 287.709 |
| 0.6944444444444445 | 283.156 |
| 0.6951388888888889 | 283.156 |
| 0.6958333333333333 | 278.603 |
| 0.6965277777777777 | 283.156 |
| 0.6972222222222223 | 278.603 |
| 0.6979166666666666 | 278.603 |
| 0.6986111111111111 | 274.047 |
| 0.6993055555555556 | 274.047 |
| 0.7000000000000001 | 274.047 |
| 0.7006944444444444 | 274.047 |
| 0.7013888888888888 | 278.603 |
| 0.7020833333333334 | 278.603 |
| 0.7027777777777778 | 283.156 |
| 0.7034722222222222 | 283.156 |
| 0.7041666666666666 | 278.603 |
| 0.7048611111111112 | 274.047 |
| 0.7055555555555556 | 264.932 |
| 0.7062499999999999 | 260.373 |
| 0.7069444444444444 | 255.813 |
| 0.7076388888888889 | 246.689 |
| 0.7083333333333334 | 237.564 |
| 0.7090277777777777 | 233 |
| 0.7097222222222223 | 228.436 |
| 0.7104166666666667 | 219.309 |
| 0.7111111111111111 | 219.309 |
| 0.7118055555555555 | 219.309 |
| 0.7125 | 214.746 |
| 0.7131944444444445 | 219.309 |
| 0.7138888888888889 | 219.309 |
| 0.7145833333333332 | 223.873 |
| 0.7152777777777778 | 223.873 |
| 0.7159722222222222 | 223.873 |
| 0.7166666666666667 | 223.873 |
| 0.717361111111111 | 228.436 |
| 0.7180555555555556 | 228.436 |
| 0.71875 | 233 |
| 0.7194444444444444 | 237.564 |
| 0.720138888888889 | 233 |
| 0.7208333333333333 | 233 |
| 0.7215277777777778 | 228.436 |
| 0.7222222222222222 | 219.309 |
| 0.7229166666666668 | 219.309 |
| 0.7236111111111111 | 210.182 |
| 0.7243055555555555 | 210.182 |
| 0.725 | 205.62 |
| 0.7256944444444445 | 205.62 |
| 0.7263888888888889 | 201.058 |
| 0.7270833333333333 | 201.058 |
| 0.7277777777777777 | 201.058 |
| 0.7284722222222223 | 196.497 |
| 0.7291666666666666 | 191.937 |
| 0.7298611111111111 | 191.937 |
| 0.7305555555555556 | 191.937 |
| 0.7312500000000001 | 187.378 |
| 0.7319444444444444 | 182.82 |
| 0.7326388888888888 | 182.82 |
| 0.7333333333333334 | 178.264 |
| 0.7340277777777778 | 173.709 |
| 0.7347222222222222 | 173.709 |
| 0.7354166666666666 | 173.709 |
| 0.7361111111111112 | 173.709 |
| 0.7368055555555556 | 169.156 |
| 0.7374999999999999 | 169.156 |
| 0.7381944444444444 | 169.156 |
| 0.7388888888888889 | 164.605 |
| 0.7395833333333334 | 164.605 |
| 0.7402777777777777 | 164.605 |
| 0.7409722222222223 | 164.605 |
| 0.7416666666666667 | 164.605 |
| 0.7423611111111111 | 164.605 |
| 0.7430555555555555 | 160.056 |
| 0.74375 | 160.056 |
| 0.7444444444444445 | 160.056 |
| 0.7451388888888889 | 155.509 |
| 0.7458333333333332 | 155.509 |
| 0.7465277777777778 | 155.509 |
| 0.7472222222222222 | 141.884 |
| 0.7479166666666667 | 137.347 |
| 0.748611111111111 | 141.884 |
| 0.7493055555555556 | 146.423 |
| 0.75 | 150.964 |
| 0.7506944444444444 | 150.964 |
| 0.751388888888889 | 146.423 |
| 0.7520833333333333 | 146.423 |
| 0.7527777777777778 | 146.423 |
| 0.7534722222222222 | 141.884 |
| 0.7541666666666668 | 119.235 |
| 0.7548611111111111 | 128.284 |
| 0.7555555555555555 | 141.884 |
| 0.75625 | 132.814 |
| 0.7569444444444445 | 110.201 |
| 0.7576388888888889 | 119.235 |
| 0.7583333333333333 | 110.201 |
| 0.7590277777777777 | 110.201 |
| 0.7597222222222223 | 128.284 |
| 0.7604166666666666 | 119.235 |
| 0.7611111111111111 | 101.184 |
| 0.7618055555555556 | 101.184 |
| 0.7625000000000001 | 119.235 |
| 0.7631944444444444 | 123.758 |
| 0.7638888888888888 | 110.201 |
| 0.7645833333333334 | 96.682 |
| 0.7652777777777778 | 96.682 |
| 0.7659722222222222 | 96.682 |
| 0.7666666666666666 | 101.184 |
| 0.7673611111111112 | 105.69 |
| 0.7680555555555556 | 101.184 |
| 0.7687499999999999 | 101.184 |
| 0.7694444444444444 | 96.682 |
| 0.7701388888888889 | 101.184 |
| 0.7708333333333334 | 101.184 |
| 0.7715277777777777 | 123.758 |
| 0.7722222222222223 | 119.235 |
| 0.7729166666666667 | 119.235 |
| 0.7736111111111111 | 119.235 |
| 0.7743055555555555 | 119.235 |
| 0.775 | 119.235 |
| 0.7756944444444445 | 119.235 |
| 0.7763888888888889 | 114.716 |
| 0.7770833333333332 | 114.716 |
| 0.7777777777777778 | 114.716 |
| 0.7784722222222222 | 114.716 |
| 0.7791666666666667 | 110.201 |
| 0.779861111111111 | 110.201 |
| 0.7805555555555556 | 110.201 |
| 0.78125 | 110.201 |
| 0.7819444444444444 | 105.69 |
| 0.782638888888889 | 105.69 |
| 0.7833333333333333 | 105.69 |
| 0.7840277777777778 | 101.184 |
| 0.7847222222222222 | 96.682 |
| 0.7854166666666668 | 92.184 |
| 0.7861111111111111 | 96.682 |
| 0.7868055555555555 | 96.682 |
| 0.7875 | 83.205 |
| 0.7881944444444445 | 83.205 |
| 0.7888888888888889 | 78.722 |
| 0.7895833333333333 | 92.184 |
| 0.7902777777777777 | 92.184 |
| 0.7909722222222223 | 92.184 |
| 0.7916666666666666 | 92.184 |
| 0.7923611111111111 | 87.692 |
| 0.7930555555555556 | 87.692 |
| 0.7937500000000001 | 87.692 |
| 0.7944444444444444 | 78.722 |
| 0.7951388888888888 | 78.722 |
| 0.7958333333333334 | 78.722 |
| 0.7965277777777778 | 83.205 |
| 0.7972222222222222 | 83.205 |
| 0.7979166666666666 | 78.722 |
| 0.7986111111111112 | 78.722 |
| 0.7993055555555556 | 74.246 |
| 0.7999999999999999 | 74.246 |
| 0.8006944444444444 | 69.775 |
| 0.8013888888888889 | 69.775 |
| 0.8020833333333334 | 69.775 |
| 0.8027777777777777 | 69.775 |
| 0.8034722222222223 | 65.31 |
| 0.8041666666666667 | 65.31 |
| 0.8048611111111111 | 65.31 |
| 0.8055555555555555 | 65.31 |
| 0.80625 | 65.31 |
| 0.8069444444444445 | 60.85 |
| 0.8076388888888889 | 60.85 |
| 0.8083333333333332 | 60.85 |
| 0.8090277777777778 | 56.398 |
| 0.8097222222222222 | 56.398 |
| 0.8104166666666667 | 56.398 |
| 0.811111111111111 | 56.398 |
| 0.8118055555555556 | 51.951 |
| 0.8125 | 51.951 |
| 0.8131944444444444 | 51.951 |
| 0.813888888888889 | 51.951 |
| 0.8145833333333333 | 51.951 |
| 0.8152777777777778 | 47.511 |
| 0.8159722222222222 | 47.511 |
| 0.8166666666666668 | 47.511 |
| 0.8173611111111111 | 47.511 |
| 0.8180555555555555 | 47.511 |
| 0.81875 | 43.079 |
| 0.8194444444444445 | 43.079 |
| 0.8201388888888889 | 38.653 |
| 0.8208333333333333 | 38.653 |
| 0.8215277777777777 | 34.234 |
| 0.8222222222222223 | 34.234 |
| 0.8229166666666666 | 29.823 |
| 0.8236111111111111 | 29.823 |
| 0.8243055555555556 | 29.823 |
| 0.8250000000000001 | 25.419 |
| 0.8256944444444444 | 25.419 |
| 0.8263888888888888 | 21.024 |
| 0.8270833333333334 | 21.024 |
| 0.8277777777777778 | 21.024 |
| 0.8284722222222222 | 21.024 |
| 0.8291666666666666 | 16.636 |
| 0.8298611111111112 | 16.636 |
| 0.8305555555555556 | 12.257 |
| 0.8312499999999999 | 12.257 |
| 0.8319444444444444 | 12.257 |
| 0.8326388888888889 | 7.887 |
| 0.8333333333333334 | 7.887 |
| 0.8340277777777777 | 7.887 |
| 0.8347222222222223 | 7.887 |
| 0.8354166666666667 | 7.887 |
| 0.8361111111111111 | 7.887 |
| 0.8368055555555555 | 7.887 |
| 0.8375 | 7.887 |
| 0.8381944444444445 | 7.887 |
| 0.8388888888888889 | 3.525 |
| 0.8395833333333332 | 3.525 |
| 0.8402777777777778 | 3.525 |
| 0.8409722222222222 | 3.525 |
| 0.8416666666666667 | 3.525 |
| 0.842361111111111 | 3.525 |
| 0.8430555555555556 | 3.525 |
| 0.84375 | 3.525 |
| 0.8444444444444444 | 3.525 |
| 0.845138888888889 | 3.525 |
| 0.8458333333333333 | 3.525 |
| 0.8465277777777778 | 0 |
| 0.8472222222222222 | 0 |
| 0.8479166666666668 | 0 |
| 0.8486111111111111 | 0 |
| 0.8493055555555555 | 0 |
| 0.85 | 0 |
| 0.8506944444444445 | 0 |
| 0.8513888888888889 | 0 |
| 0.8520833333333333 | 0 |
| 0.8527777777777777 | 0 |
| 0.8534722222222223 | 0 |
| 0.8541666666666666 | 0 |
| 0.8548611111111111 | 0 |
| 0.8555555555555556 | 0 |
| 0.8562500000000001 | 0 |
| 0.8569444444444444 | 0 |
| 0.8576388888888888 | 0 |
| 0.8583333333333334 | 0 |
| 0.8590277777777778 | 0 |
| 0.8597222222222222 | 0 |
| 0.8604166666666666 | 0 |
| 0.8611111111111112 | 0 |
| 0.8618055555555556 | 0 |
| 0.8624999999999999 | 0 |
| 0.8631944444444444 | 0 |
| 0.8638888888888889 | 0 |
| 0.8645833333333334 | 0 |
| 0.8652777777777777 | 0 |
| 0.8659722222222223 | 0 |
| 0.8666666666666667 | 0 |
| 0.8673611111111111 | 0 |
| 0.8680555555555555 | 0 |
| 0.86875 | 0 |
| 0.8694444444444445 | 0 |
| 0.8701388888888889 | 0 |
| 0.8708333333333332 | 0 |
| 0.8715277777777778 | 0 |
| 0.8722222222222222 | 0 |
| 0.8729166666666667 | 0 |
| 0.873611111111111 | 0 |
| 0.8743055555555556 | 0 |
| 0.875 | 0 |
| 0.8756944444444444 | 0 |
| 0.876388888888889 | 0 |
| 0.8770833333333333 | 0 |
| 0.8777777777777778 | 0 |
| 0.8784722222222222 | 0 |
| 0.8791666666666668 | 0 |
| 0.8798611111111111 | 0 |
| 0.8805555555555555 | 0 |
| 0.88125 | 0 |
| 0.8819444444444445 | 0 |
| 0.8826388888888889 | 0 |
| 0.8833333333333333 | 0 |
| 0.8840277777777777 | 0 |
| 0.8847222222222223 | 0 |
| 0.8854166666666666 | 0 |
| 0.8861111111111111 | 0 |
| 0.8868055555555556 | 0 |
| 0.8875000000000001 | 0 |
| 0.8881944444444444 | 0 |
| 0.8888888888888888 | 0 |
| 0.8895833333333334 | 0 |
| 0.8902777777777778 | 0 |
| 0.8909722222222222 | 0 |
| 0.8916666666666666 | 0 |
| 0.8923611111111112 | 0 |
| 0.8930555555555556 | 0 |
| 0.8937499999999999 | 0 |
| 0.8944444444444444 | 0 |
| 0.8951388888888889 | 0 |
| 0.8958333333333334 | 0 |
| 0.8965277777777777 | 0 |
| 0.8972222222222223 | 0 |
| 0.8979166666666667 | 0 |
| 0.8986111111111111 | 0 |
| 0.8993055555555555 | 0 |
| 0.9 | 0 |
| 0.9006944444444445 | 0 |
| 0.9013888888888889 | 0 |
| 0.9020833333333332 | 0 |
| 0.9027777777777778 | 0 |
| 0.9034722222222222 | 0 |
| 0.9041666666666667 | 0 |
| 0.904861111111111 | 0 |
| 0.9055555555555556 | 0 |
| 0.90625 | 0 |
| 0.9069444444444444 | 0 |
| 0.907638888888889 | 0 |
| 0.9083333333333333 | 0 |
| 0.9090277777777778 | 0 |
| 0.9097222222222222 | 0 |
| 0.9104166666666668 | 0 |
| 0.9111111111111111 | 0 |
| 0.9118055555555555 | 0 |
| 0.9125 | 0 |
| 0.9131944444444445 | 0 |
| 0.9138888888888889 | 0 |
| 0.9145833333333333 | 0 |
| 0.9152777777777777 | 0 |
| 0.9159722222222223 | 0 |
| 0.9166666666666666 | 0 |
| 0.9173611111111111 | 0 |
| 0.9180555555555556 | 0 |
| 0.9187500000000001 | 0 |
| 0.9194444444444444 | 0 |
| 0.9201388888888888 | 0 |
| 0.9208333333333334 | 0 |
| 0.9215277777777778 | 0 |
| 0.9222222222222222 | 0 |
| 0.9229166666666666 | 0 |
| 0.9236111111111112 | 0 |
| 0.9243055555555556 | 0 |
| 0.9249999999999999 | 0 |
| 0.9256944444444444 | 0 |
| 0.9263888888888889 | 0 |
| 0.9270833333333334 | 0 |
| 0.9277777777777777 | 0 |
| 0.9284722222222223 | 0 |
| 0.9291666666666667 | 0 |
| 0.9298611111111111 | 0 |
| 0.9305555555555555 | 0 |
| 0.93125 | 0 |
| 0.9319444444444445 | 0 |
| 0.9326388888888889 | 0 |
| 0.9333333333333332 | 0 |
| 0.9340277777777778 | 0 |
| 0.9347222222222222 | 0 |
| 0.9354166666666667 | 0 |
| 0.936111111111111 | 0 |
| 0.9368055555555556 | 0 |
| 0.9375 | 0 |
| 0.9381944444444444 | 0 |
| 0.938888888888889 | 0 |
| 0.9395833333333333 | 0 |
| 0.9402777777777778 | 0 |
| 0.9409722222222222 | 0 |
| 0.9416666666666668 | 0 |
| 0.9423611111111111 | 0 |
| 0.9430555555555555 | 0 |
| 0.94375 | 0 |
| 0.9444444444444445 | 0 |
| 0.9451388888888889 | 0 |
| 0.9458333333333333 | 0 |
| 0.9465277777777777 | 0 |
| 0.9472222222222223 | 0 |
| 0.9479166666666666 | 0 |
| 0.9486111111111111 | 0 |
| 0.9493055555555556 | 0 |
| 0.9500000000000001 | 0 |
| 0.9506944444444444 | 0 |
| 0.9513888888888888 | 0 |
| 0.9520833333333334 | 0 |
| 0.9527777777777778 | 0 |
| 0.9534722222222222 | 0 |
| 0.9541666666666666 | 0 |
| 0.9548611111111112 | 0 |
| 0.9555555555555556 | 0 |
| 0.9562499999999999 | 0 |
| 0.9569444444444444 | 0 |
| 0.9576388888888889 | 0 |
| 0.9583333333333334 | 0 |
| 0.9590277777777777 | 0 |
| 0.9597222222222223 | 0 |
| 0.9604166666666667 | 0 |
| 0.9611111111111111 | 0 |
| 0.9618055555555555 | 0 |
| 0.9625 | 0 |
| 0.9631944444444445 | 0 |
| 0.9638888888888889 | 0 |
| 0.9645833333333332 | 0 |
| 0.9652777777777778 | 0 |
| 0.9659722222222222 | 0 |
| 0.9666666666666667 | 0 |
| 0.967361111111111 | 0 |
| 0.9680555555555556 | 0 |
| 0.96875 | 0 |
| 0.9694444444444444 | 0 |
| 0.970138888888889 | 0 |
| 0.9708333333333333 | 0 |
| 0.9715277777777778 | 0 |
| 0.9722222222222222 | 0 |
| 0.9729166666666668 | 0 |
| 0.9736111111111111 | 0 |
| 0.9743055555555555 | 0 |
| 0.975 | 0 |
| 0.9756944444444445 | 0 |
| 0.9763888888888889 | 0 |
| 0.9770833333333333 | 0 |
| 0.9777777777777777 | 0 |
| 0.9784722222222223 | 0 |
| 0.9791666666666666 | 0 |
| 0.9798611111111111 | 0 |
| 0.9805555555555556 | 0 |
| 0.9812500000000001 | 0 |
| 0.9819444444444444 | 0 |
| 0.9826388888888888 | 0 |
| 0.9833333333333334 | 0 |
| 0.9840277777777778 | 0 |
| 0.9847222222222222 | 0 |
| 0.9854166666666666 | 0 |
| 0.9861111111111112 | 0 |
| 0.9868055555555556 | 0 |
| 0.9874999999999999 | 0 |
| 0.9881944444444444 | 0 |
| 0.9888888888888889 | 0 |
| 0.9895833333333334 | 0 |
| 0.9902777777777777 | 0 |
| 0.9909722222222223 | 0 |
| 0.9916666666666667 | 0 |
| 0.9923611111111111 | 0 |
| 0.9930555555555555 | 0 |
| 0.99375 | 0 |
| 0.9944444444444445 | 0 |
| 0.9951388888888889 | 0 |
| 0.9958333333333332 | 0 |
| 0.9965277777777778 | 0 |
| 0.9972222222222222 | 0 |
| 0.9979166666666667 | 0 |
| 0.998611111111111 | 0 |
| 0.9993055555555556 | 0 |